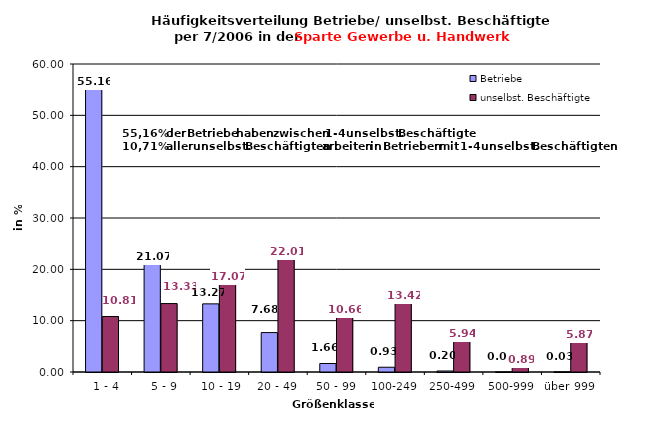
| Category | Betriebe | unselbst. Beschäftigte |
|---|---|---|
|   1 - 4 | 55.163 | 10.812 |
|   5 - 9 | 21.068 | 13.329 |
|  10 - 19 | 13.273 | 17.066 |
| 20 - 49 | 7.677 | 22.012 |
| 50 - 99 | 1.656 | 10.657 |
| 100-249 | 0.926 | 13.424 |
| 250-499 | 0.195 | 5.943 |
| 500-999 | 0.017 | 0.886 |
| über 999 | 0.025 | 5.87 |